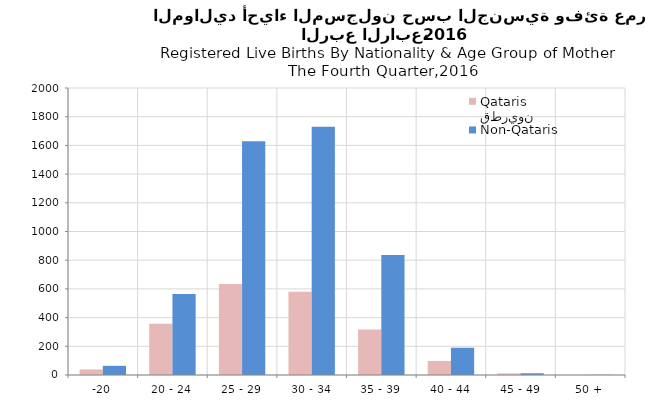
| Category | قطريون
Qataris | غير قطريين
Non-Qataris |
|---|---|---|
| -20 | 39 | 64 |
| 20 - 24 | 358 | 564 |
| 25 - 29 | 635 | 1629 |
| 30 - 34 | 581 | 1730 |
| 35 - 39 | 317 | 836 |
| 40 - 44 | 98 | 190 |
| 45 - 49 | 11 | 12 |
| 50 + | 0 | 1 |